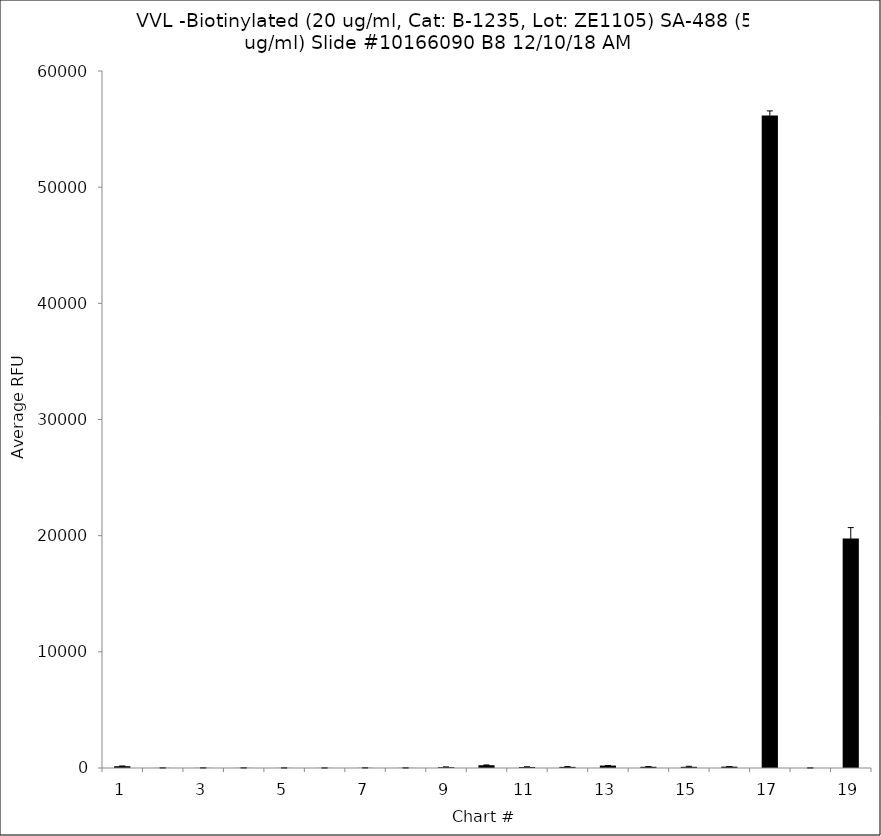
| Category | Series 0 |
|---|---|
| 1.0 | 155.25 |
| 2.0 | 8.75 |
| 3.0 | 10.25 |
| 4.0 | 10.5 |
| 5.0 | 7 |
| 6.0 | 5.5 |
| 7.0 | 11.5 |
| 8.0 | 8.75 |
| 9.0 | 72.75 |
| 10.0 | 237.5 |
| 11.0 | 86 |
| 12.0 | 96.25 |
| 13.0 | 208 |
| 14.0 | 104.75 |
| 15.0 | 102.75 |
| 16.0 | 115.75 |
| 17.0 | 56175.5 |
| 18.0 | -3.5 |
| 19.0 | 19762 |